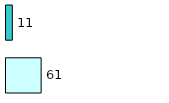
| Category | Series 0 | Series 1 |
|---|---|---|
| 0 | 61 | 11 |